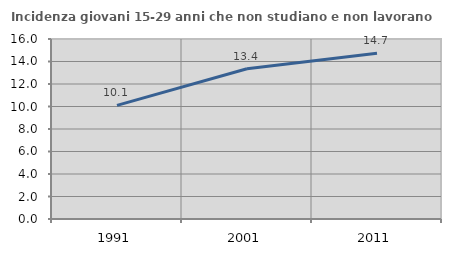
| Category | Incidenza giovani 15-29 anni che non studiano e non lavorano  |
|---|---|
| 1991.0 | 10.099 |
| 2001.0 | 13.352 |
| 2011.0 | 14.729 |